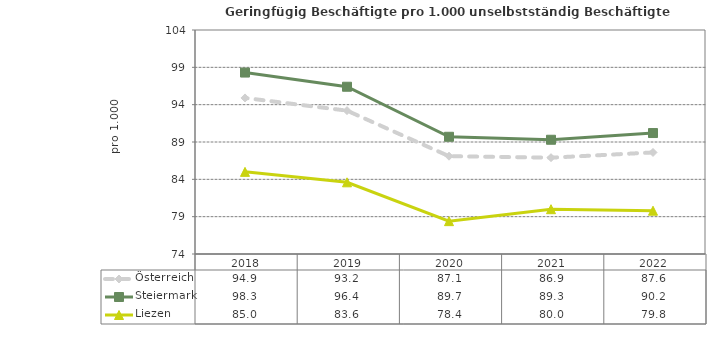
| Category | Österreich | Steiermark | Liezen |
|---|---|---|---|
| 2022.0 | 87.6 | 90.2 | 79.8 |
| 2021.0 | 86.9 | 89.3 | 80 |
| 2020.0 | 87.1 | 89.7 | 78.4 |
| 2019.0 | 93.2 | 96.4 | 83.6 |
| 2018.0 | 94.9 | 98.3 | 85 |